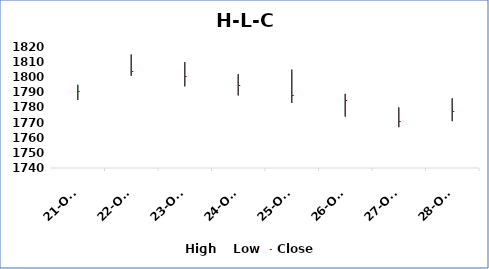
| Category | High | Low | Close |
|---|---|---|---|
| 2021-10-21 | 1795 | 1785 | 1791 |
| 2021-10-22 | 1815 | 1801 | 1804 |
| 2021-10-23 | 1810 | 1794 | 1801 |
| 2021-10-24 | 1802 | 1788 | 1795 |
| 2021-10-25 | 1805 | 1783 | 1788 |
| 2021-10-26 | 1789 | 1774 | 1785 |
| 2021-10-27 | 1780 | 1767 | 1771 |
| 2021-10-28 | 1786 | 1771 | 1778 |